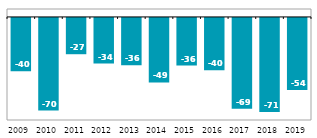
| Category | CZK billion |
|---|---|
| 2009 | -40.411 |
| 2010 | -70.107 |
| 2011 | -27.464 |
| 2012 | -34.494 |
| 2013 | -35.753 |
| 2014 | -48.794 |
| 2015 | -36.044 |
| 2016 | -39.59 |
| 2017 | -68.638 |
| 2018 | -71.24 |
| 2019 | -54.449 |